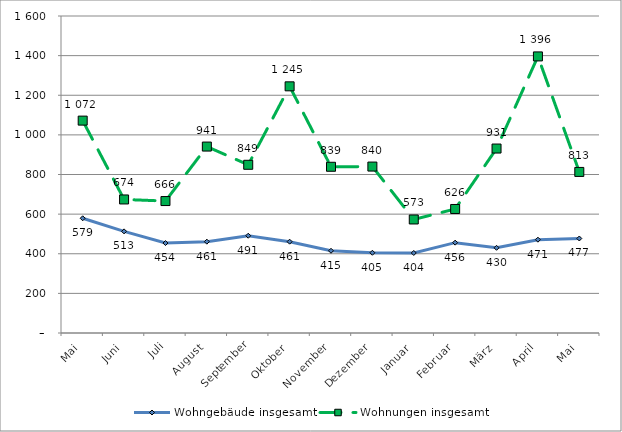
| Category | Wohngebäude insgesamt | Wohnungen insgesamt |
|---|---|---|
| Mai | 579 | 1072 |
| Juni | 513 | 674 |
| Juli | 454 | 666 |
| August | 461 | 941 |
| September | 491 | 849 |
| Oktober | 461 | 1245 |
| November | 415 | 839 |
| Dezember | 405 | 840 |
| Januar | 404 | 573 |
| Februar | 456 | 626 |
| März | 430 | 931 |
| April | 471 | 1396 |
| Mai | 477 | 813 |